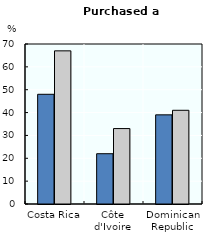
| Category | Immigrants without regular migration status | immigrants with regular migration status |
|---|---|---|
| Costa Rica | 48 | 67 |
| Côte d'Ivoire | 22 | 33 |
| Dominican Republic | 39 | 41 |